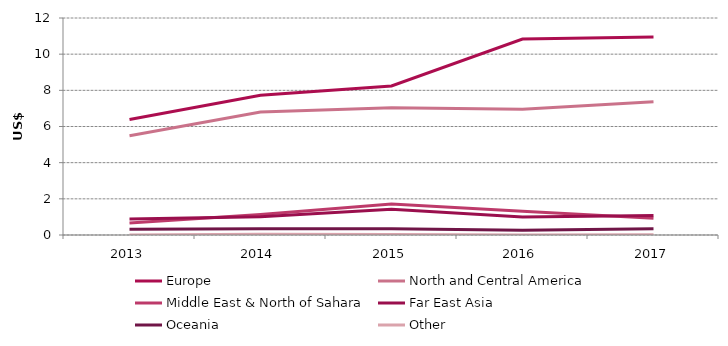
| Category | Europe | North and Central America | Middle East & North of Sahara | Far East Asia | Oceania | Other |
|---|---|---|---|---|---|---|
| 2013 | 6.385 | 5.493 | 0.67 | 0.887 | 0.313 | 0.007 |
| 2014 | 7.73 | 6.801 | 1.13 | 1.005 | 0.348 | 0.043 |
| 2015 | 8.243 | 7.039 | 1.715 | 1.422 | 0.339 | 0.025 |
| 2016 | 10.836 | 6.956 | 1.315 | 0.993 | 0.259 | 0.007 |
| 2017 | 10.954 | 7.368 | 0.921 | 1.083 | 0.35 | 0.007 |